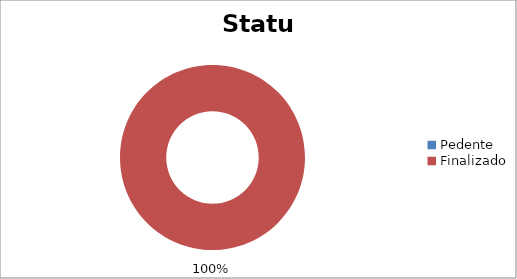
| Category | Series 0 |
|---|---|
| Pedente | 0 |
| Finalizado | 1 |